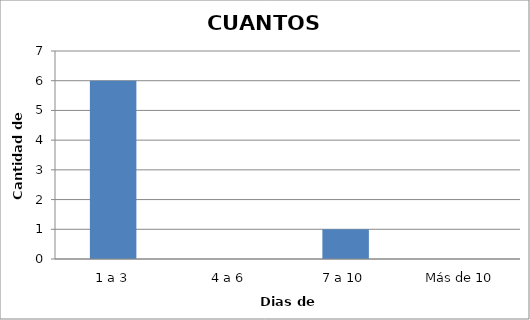
| Category | Series 0 |
|---|---|
| 1 a 3 | 6 |
| 4 a 6 | 0 |
| 7 a 10 | 1 |
| Más de 10 | 0 |